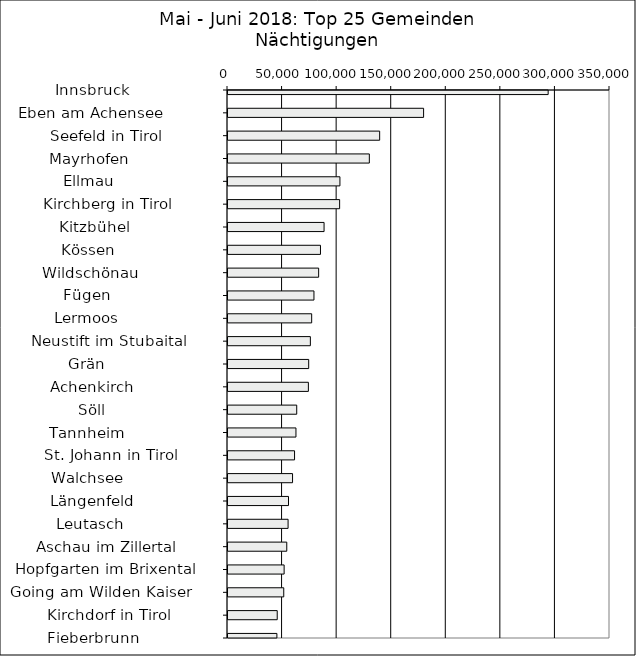
| Category | Series 0 |
|---|---|
|   Innsbruck                  | 293341 |
|   Eben am Achensee           | 179218 |
|   Seefeld in Tirol           | 138963 |
|   Mayrhofen                  | 129502 |
|   Ellmau                     | 102560 |
|   Kirchberg in Tirol         | 102277 |
|   Kitzbühel                  | 88025 |
|   Kössen                     | 84736 |
|   Wildschönau                | 83055 |
|   Fügen                      | 78761 |
|   Lermoos                    | 76663 |
|   Neustift im Stubaital      | 75467 |
|   Grän                       | 73940 |
|   Achenkirch                 | 73653 |
|   Söll                       | 62970 |
|   Tannheim                   | 62275 |
|   St. Johann in Tirol        | 60973 |
|   Walchsee                   | 59146 |
|   Längenfeld                 | 55440 |
|   Leutasch                   | 55054 |
|   Aschau im Zillertal        | 53856 |
|   Hopfgarten im Brixental    | 51435 |
|   Going am Wilden Kaiser     | 51094 |
|   Kirchdorf in Tirol         | 45107 |
|   Fieberbrunn                | 44797 |